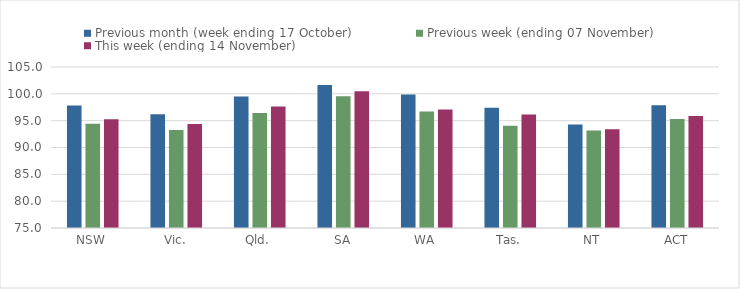
| Category | Previous month (week ending 17 October) | Previous week (ending 07 November) | This week (ending 14 November) |
|---|---|---|---|
| NSW | 97.81 | 94.41 | 95.25 |
| Vic. | 96.18 | 93.27 | 94.39 |
| Qld. | 99.48 | 96.44 | 97.66 |
| SA | 101.65 | 99.57 | 100.48 |
| WA | 99.86 | 96.71 | 97.08 |
| Tas. | 97.43 | 94.07 | 96.15 |
| NT | 94.28 | 93.18 | 93.39 |
| ACT | 97.87 | 95.31 | 95.87 |